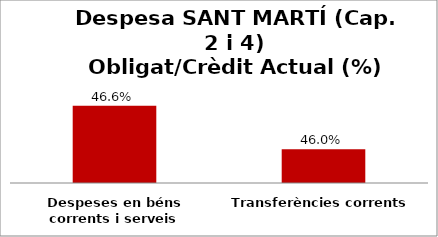
| Category | Series 0 |
|---|---|
| Despeses en béns corrents i serveis | 0.466 |
| Transferències corrents | 0.46 |